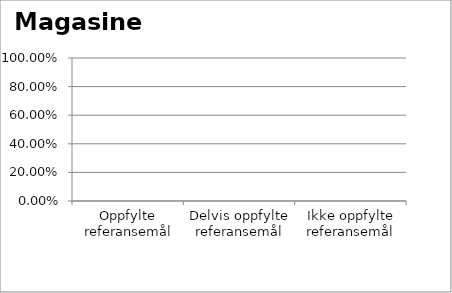
| Category | Magasiner |
|---|---|
| Oppfylte referansemål | 0 |
| Delvis oppfylte referansemål | 0 |
| Ikke oppfylte referansemål | 0 |